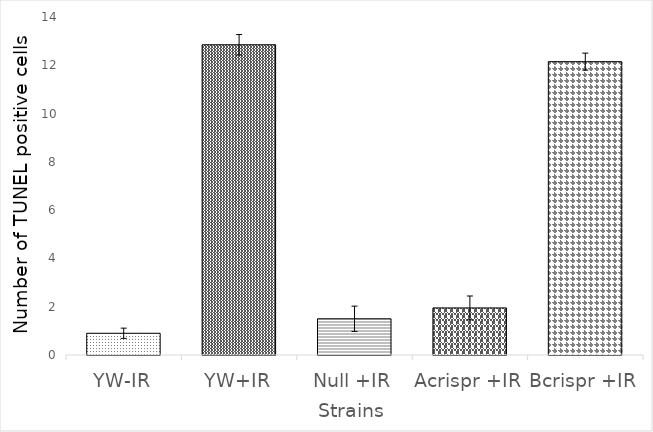
| Category | germline |
|---|---|
| YW-IR | 0.9 |
| YW+IR | 12.85 |
| Null +IR | 1.5 |
| Acrispr +IR | 1.95 |
| Bcrispr +IR | 12.15 |